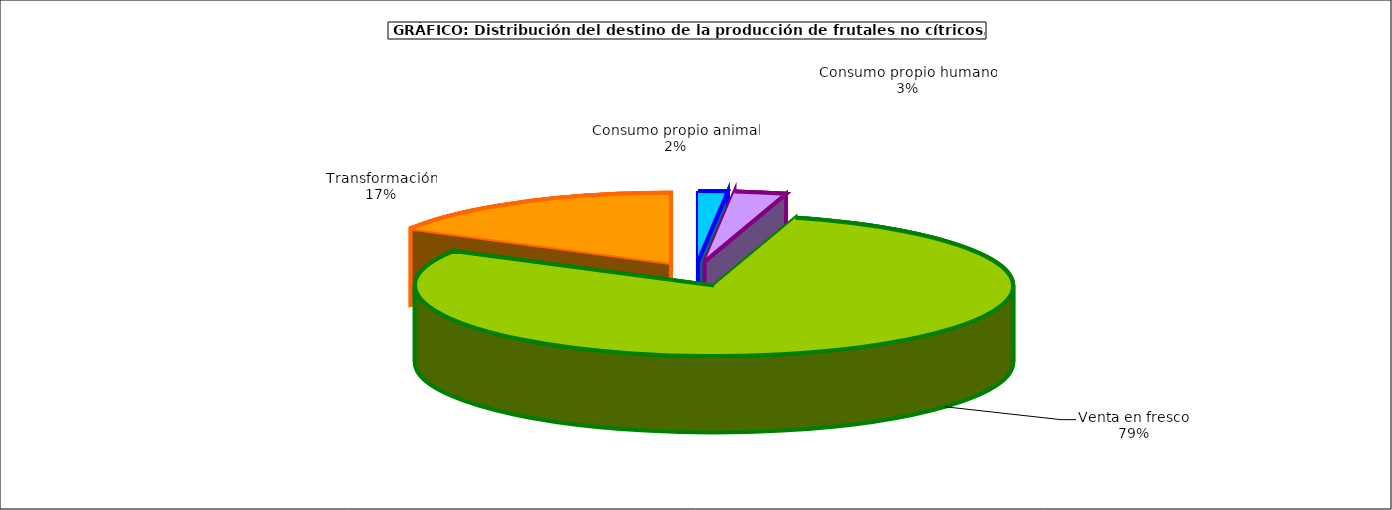
| Category | frutales no cítricos |
|---|---|
| 0 | 70327 |
| 1 | 123371 |
| 2 | 3483135 |
| 3 | 742265 |